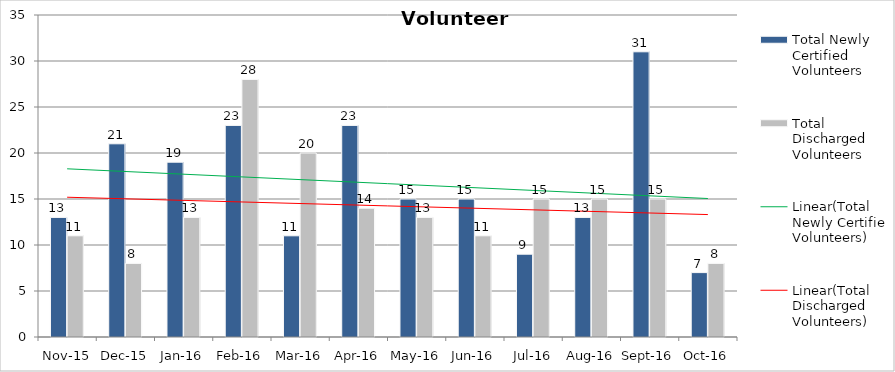
| Category | Total Newly Certified Volunteers | Total Discharged Volunteers |
|---|---|---|
| Nov-15 | 13 | 11 |
| Dec-15 | 21 | 8 |
| Jan-16 | 19 | 13 |
| Feb-16 | 23 | 28 |
| Mar-16 | 11 | 20 |
| Apr-16 | 23 | 14 |
| May-16 | 15 | 13 |
| Jun-16 | 15 | 11 |
| Jul-16 | 9 | 15 |
| Aug-16 | 13 | 15 |
| Sep-16 | 31 | 15 |
| Oct-16 | 7 | 8 |